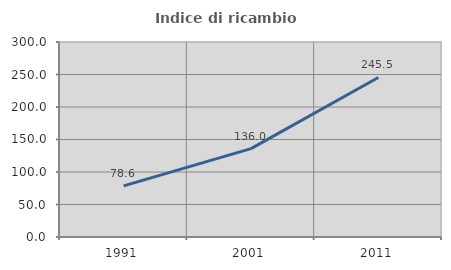
| Category | Indice di ricambio occupazionale  |
|---|---|
| 1991.0 | 78.571 |
| 2001.0 | 136 |
| 2011.0 | 245.455 |